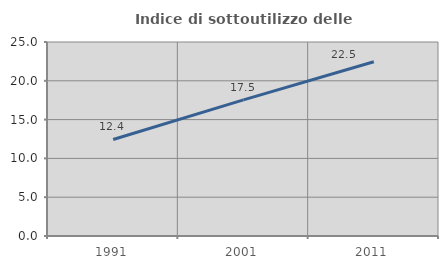
| Category | Indice di sottoutilizzo delle abitazioni  |
|---|---|
| 1991.0 | 12.439 |
| 2001.0 | 17.548 |
| 2011.0 | 22.456 |